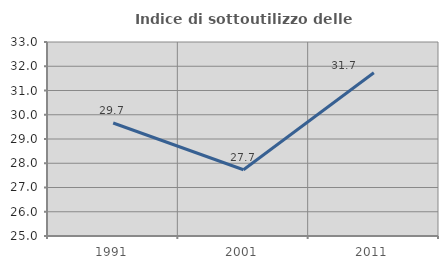
| Category | Indice di sottoutilizzo delle abitazioni  |
|---|---|
| 1991.0 | 29.661 |
| 2001.0 | 27.731 |
| 2011.0 | 31.731 |